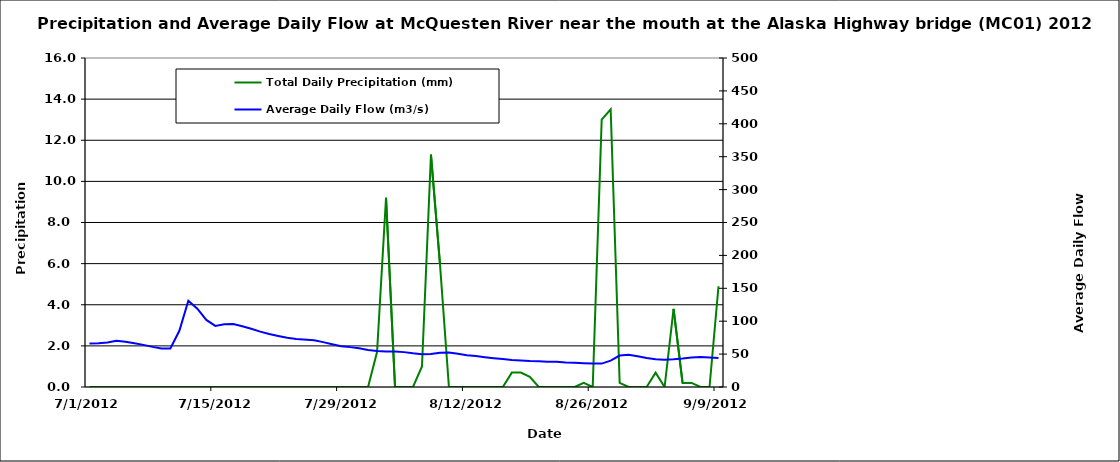
| Category | Total Daily Precipitation (mm) |
|---|---|
| 41091.0 | 0 |
| 41092.0 | 0 |
| 41093.0 | 0 |
| 41094.0 | 0 |
| 41095.0 | 0 |
| 41096.0 | 0 |
| 41097.0 | 0 |
| 41098.0 | 0 |
| 41099.0 | 0 |
| 41100.0 | 0 |
| 41101.0 | 0 |
| 41102.0 | 0 |
| 41103.0 | 0 |
| 41104.0 | 0 |
| 41105.0 | 0 |
| 41106.0 | 0 |
| 41107.0 | 0 |
| 41108.0 | 0 |
| 41109.0 | 0 |
| 41110.0 | 0 |
| 41111.0 | 0 |
| 41112.0 | 0 |
| 41113.0 | 0 |
| 41114.0 | 0 |
| 41116.0 | 0 |
| 41117.0 | 0 |
| 41118.0 | 0 |
| 41119.0 | 0 |
| 41120.0 | 0 |
| 41121.0 | 0 |
| 41122.0 | 0 |
| 41123.0 | 1.7 |
| 41124.0 | 9.2 |
| 41125.0 | 0 |
| 41126.0 | 0 |
| 41127.0 | 0 |
| 41128.0 | 1 |
| 41129.0 | 11.3 |
| 41130.0 | 6 |
| 41131.0 | 0 |
| 41132.0 | 0 |
| 41133.0 | 0 |
| 41134.0 | 0 |
| 41135.0 | 0 |
| 41136.0 | 0 |
| 41137.0 | 0 |
| 41138.0 | 0.7 |
| 41138.0 | 0.7 |
| 41139.0 | 0.7 |
| 41139.0 | 0.7 |
| 41140.0 | 0.5 |
| 41141.0 | 0 |
| 41142.0 | 0 |
| 41143.0 | 0 |
| 41144.0 | 0 |
| 41145.0 | 0 |
| 41146.0 | 0.2 |
| 41147.0 | 0 |
| 41148.0 | 13 |
| 41149.0 | 13.5 |
| 41150.0 | 0.2 |
| 41151.0 | 0 |
| 41152.0 | 0 |
| 41153.0 | 0 |
| 41154.0 | 0.7 |
| 41155.0 | 0 |
| 41156.0 | 3.8 |
| 41157.0 | 0.2 |
| 41158.0 | 0.2 |
| 41159.0 | 0 |
| 41160.0 | 0 |
| 41161.0 | 4.9 |